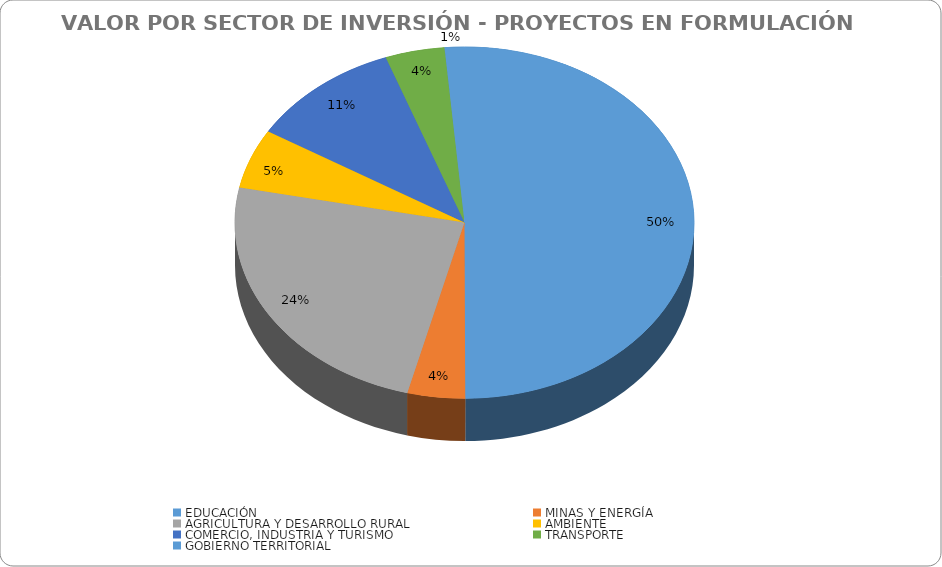
| Category | VALOR POR SECTOR DE INVERSIÓN |
|---|---|
| EDUCACIÓN | 143576037310 |
| MINAS Y ENERGÍA | 11656000000 |
| AGRICULTURA Y DESARROLLO RURAL | 69574872500 |
| AMBIENTE  | 15743682495 |
| COMERCIO, INDUSTRIA Y TURISMO | 30900000000 |
| TRANSPORTE | 12000000000 |
| GOBIERNO TERRITORIAL | 4000000000 |